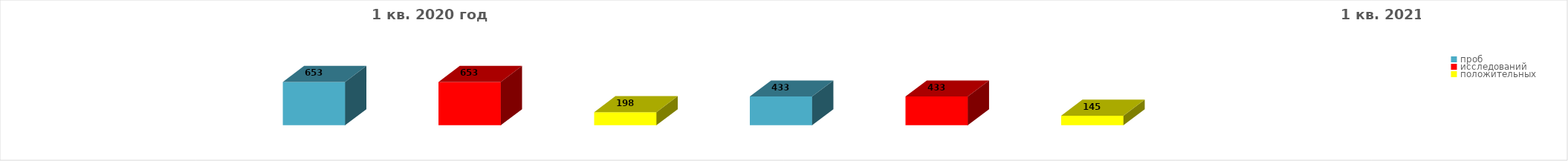
| Category | Series 4 |
|---|---|
| проб | 653 |
| исследований | 653 |
| положительных | 198 |
| проб | 433 |
| исследований | 433 |
| положительных | 145 |